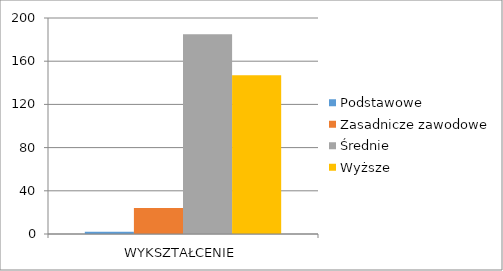
| Category | Podstawowe | Zasadnicze zawodowe | Średnie | Wyższe |
|---|---|---|---|---|
| WYKSZTAŁCENIE | 2 | 24 | 185 | 147 |